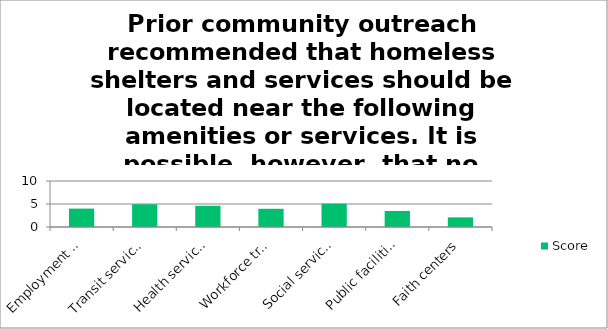
| Category | Score |
|---|---|
| Employment opportunities | 4 |
| Transit services | 4.94 |
| Health services | 4.61 |
| Workforce training | 3.96 |
| Social services | 5.07 |
| Public facilities | 3.49 |
| Faith centers | 2.09 |